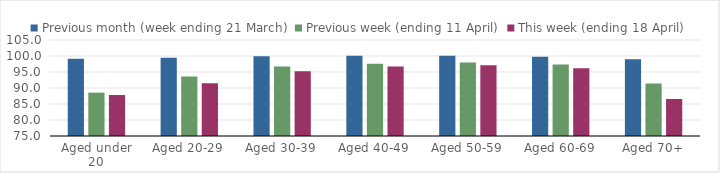
| Category | Previous month (week ending 21 March) | Previous week (ending 11 April) | This week (ending 18 April) |
|---|---|---|---|
| Aged under 20 | 99.118 | 88.543 | 87.802 |
| Aged 20-29 | 99.462 | 93.584 | 91.467 |
| Aged 30-39 | 99.892 | 96.719 | 95.268 |
| Aged 40-49 | 100.062 | 97.568 | 96.738 |
| Aged 50-59 | 100.097 | 98.001 | 97.132 |
| Aged 60-69 | 99.796 | 97.336 | 96.175 |
| Aged 70+ | 98.948 | 91.391 | 86.566 |